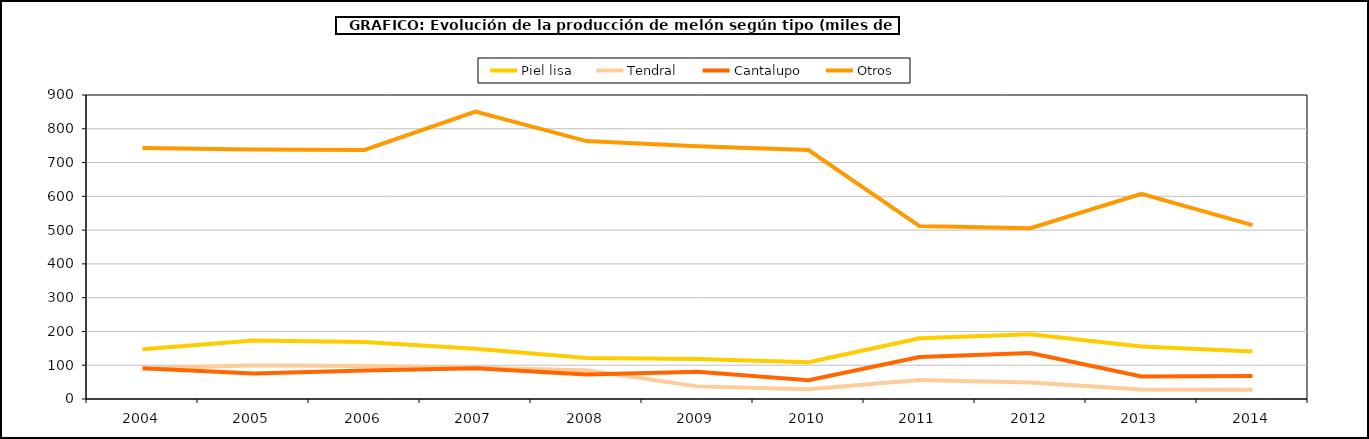
| Category | Piel lisa | Tendral | Cantalupo | Otros |
|---|---|---|---|---|
| 2004.0 | 147.316 | 89.413 | 91.298 | 743.128 |
| 2005.0 | 173.147 | 99.657 | 75.181 | 738.733 |
| 2006.0 | 168.646 | 97.841 | 84.083 | 737.347 |
| 2007.0 | 149.064 | 92.263 | 90.873 | 850.954 |
| 2008.0 | 121.633 | 84.85 | 72.334 | 763.622 |
| 2009.0 | 118.315 | 37.372 | 81.013 | 748.086 |
| 2010.0 | 108.94 | 28.98 | 55.599 | 737.036 |
| 2011.0 | 179.519 | 56.591 | 124.015 | 511.871 |
| 2012.0 | 191.896 | 49.169 | 136.333 | 505.471 |
| 2013.0 | 155.121 | 28.073 | 66.453 | 607.304 |
| 2014.0 | 140.682 | 27.23 | 67.816 | 514.864 |